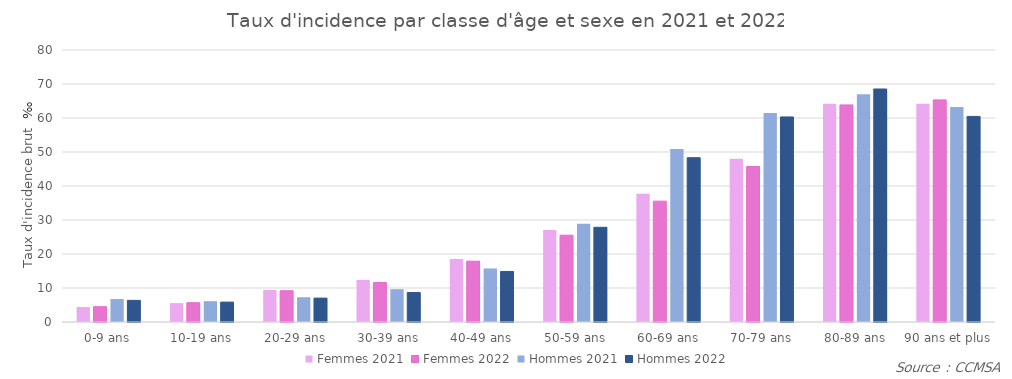
| Category | Femmes 2021 | Femmes 2022 | Hommes 2021 | Hommes 2022 |
|---|---|---|---|---|
| 0-9 ans | 4.402 | 4.498 | 6.746 | 6.362 |
| 10-19 ans | 5.559 | 5.667 | 6.127 | 5.855 |
| 20-29 ans | 9.433 | 9.197 | 7.283 | 7.022 |
| 30-39 ans | 12.393 | 11.624 | 9.653 | 8.67 |
| 40-49 ans | 18.536 | 17.887 | 15.748 | 14.87 |
| 50-59 ans | 27.079 | 25.535 | 28.921 | 27.85 |
| 60-69 ans | 37.747 | 35.543 | 50.905 | 48.317 |
| 70-79 ans | 48.001 | 45.748 | 61.46 | 60.316 |
| 80-89 ans | 64.165 | 63.853 | 66.989 | 68.526 |
| 90 ans et plus | 64.197 | 65.326 | 63.202 | 60.468 |